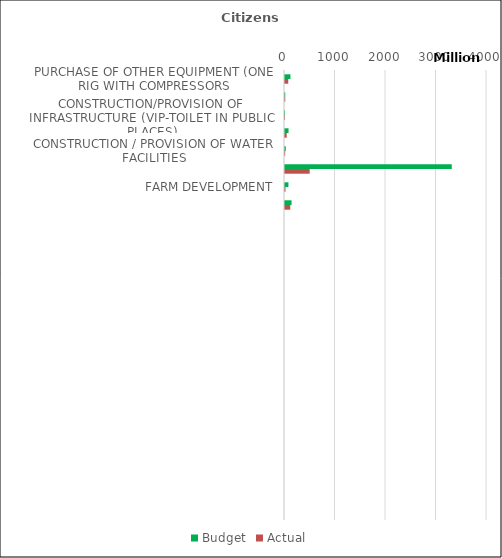
| Category | Budget | Actual |
|---|---|---|
| PURCHASE OF OTHER EQUIPMENT (ONE RIG WITH COMPRESSORS | 107881490 | 64184559 |
| CONSTRUCTION/PROVISION OF WATER FACILITIES (BOREHOLE REQUEST BY GOVT) | 5000000 | 5000000 |
| CONSTRUCTION/PROVISION OF INFRASTRUCTURE (VIP-TOILET IN PUBLIC PLACES) | 130000 | 130000 |
| CONSTRUCTION/PROVISION OF ELECTRICITY | 70000000 | 33240000 |
| CONSTRUCTION / PROVISION OF WATER FACILITIES | 15000000 | 3287575 |
| EMPOWERMENT ; COUNTERPART FUNDIND | 3302500000 | 488684579.94 |
| FARM DEVELOPMENT | 68000000 | 9674000 |
| EDUCATIONAL PROGRAMME | 130000000 | 104612562 |